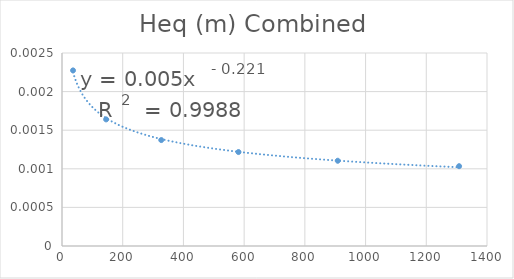
| Category | Series 0 |
|---|---|
| 36.335 | 0.002 |
| 145.34 | 0.002 |
| 327.01500000000004 | 0.001 |
| 581.36 | 0.001 |
| 908.3750000000001 | 0.001 |
| 1308.0600000000002 | 0.001 |